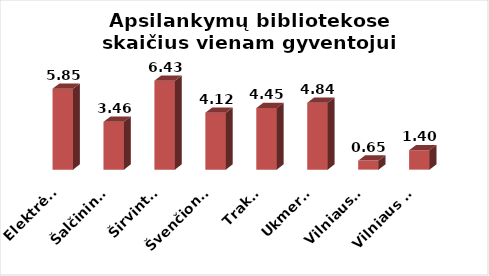
| Category | Series 0 |
|---|---|
|  Elektrėnai | 5.852 |
|  Šalčininkai | 3.455 |
|  Širvintos | 6.432 |
|  Švenčionys | 4.119 |
|  Trakai | 4.451 |
|  Ukmergė | 4.836 |
|  Vilniaus r. | 0.652 |
|  Vilniaus m. | 1.401 |